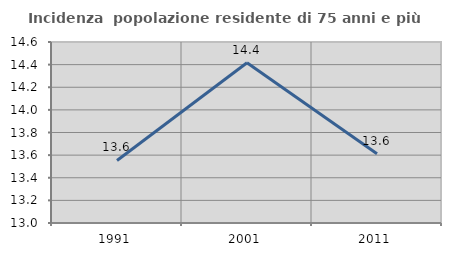
| Category | Incidenza  popolazione residente di 75 anni e più |
|---|---|
| 1991.0 | 13.553 |
| 2001.0 | 14.417 |
| 2011.0 | 13.611 |